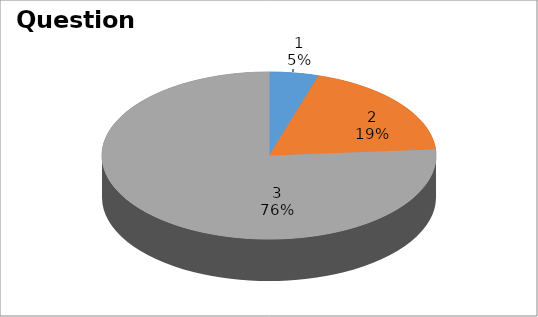
| Category | Series 0 |
|---|---|
| 0 | 1 |
| 1 | 4 |
| 2 | 16 |